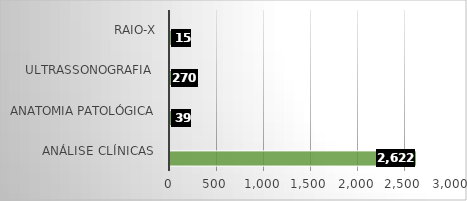
| Category | Series 0 | Series 1 |
|---|---|---|
| Análise Clínicas  | 2622 |  |
| Anatomia Patológica | 39 |  |
| Ultrassonografia  | 270 |  |
| RAIO-X | 15 |  |